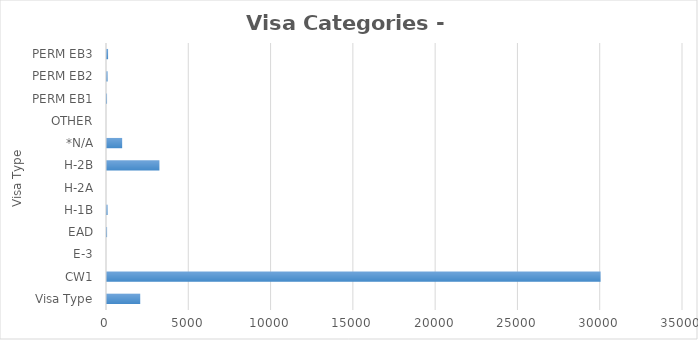
| Category | Series 0 |
|---|---|
| Visa Type | 2019 |
| CW1 | 29992 |
| E-3 | 0 |
| EAD | 5 |
| H-1B | 37 |
| H-2A | 0 |
| H-2B | 3185 |
| *N/A | 921 |
| OTHER | 0 |
| PERM EB1 | 3 |
| PERM EB2 | 37 |
| PERM EB3 | 66 |